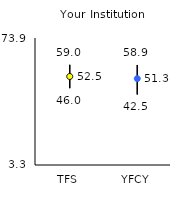
| Category | 25th | 75th | Mean |
|---|---|---|---|
| TFS | 46 | 59 | 52.5 |
| YFCY | 42.5 | 58.9 | 51.32 |